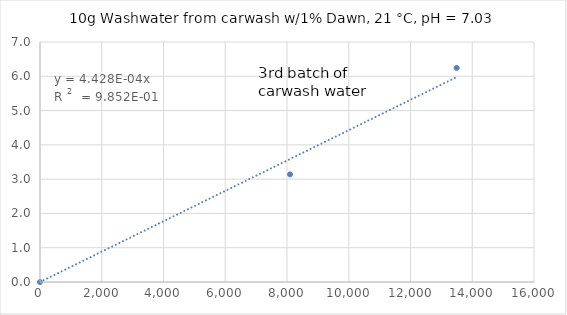
| Category | Series 0 |
|---|---|
| 0.0 | 0 |
| 8097.89665022072 | 3.138 |
| 13496.494417034535 | 6.246 |